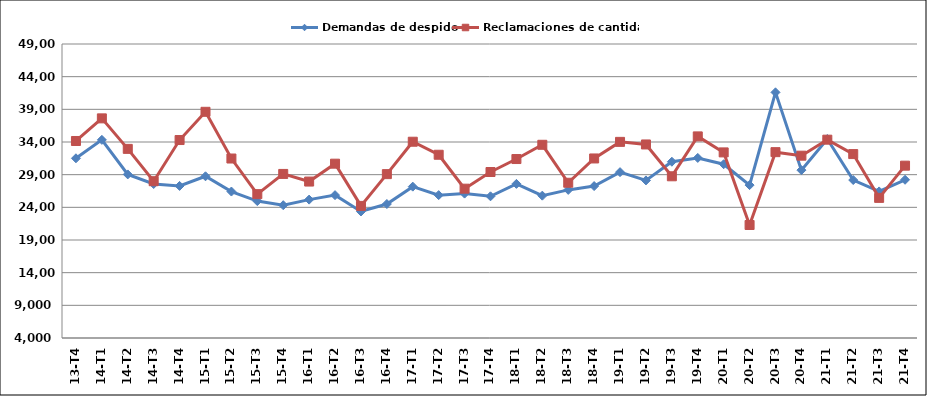
| Category | Demandas de despido | Reclamaciones de cantidad |
|---|---|---|
| 13-T4 | 31506 | 34154 |
| 14-T1 | 34327 | 37617 |
| 14-T2 | 29037 | 32948 |
| 14-T3 | 27571 | 27999 |
| 14-T4 | 27278 | 34299 |
| 15-T1 | 28755 | 38621 |
| 15-T2 | 26417 | 31470 |
| 15-T3 | 24957 | 26018 |
| 15-T4 | 24328 | 29112 |
| 16-T1 | 25182 | 27945 |
| 16-T2 | 25866 | 30682 |
| 16-T3 | 23364 | 24220 |
| 16-T4 | 24509 | 29081 |
| 17-T1 | 27166 | 34041 |
| 17-T2 | 25869 | 32047 |
| 17-T3 | 26101 | 26854 |
| 17-T4 | 25688 | 29408 |
| 18-T1 | 27589 | 31392 |
| 18-T2 | 25785 | 33573 |
| 18-T3 | 26669 | 27761 |
| 18-T4 | 27251 | 31480 |
| 19-T1 | 29386 | 34020 |
| 19-T2 | 28121 | 33623 |
| 19-T3 | 30981 | 28752 |
| 19-T4 | 31561 | 34857 |
| 20-T1 | 30597 | 32408 |
| 20-T2 | 27401 | 21297 |
| 20-T3 | 41597 | 32446 |
| 20-T4 | 29692 | 31906 |
| 21-T1 | 34461 | 34356 |
| 21-T2 | 28179 | 32151 |
| 21-T3 | 26434 | 25447 |
| 21-T4 | 28219 | 30377 |